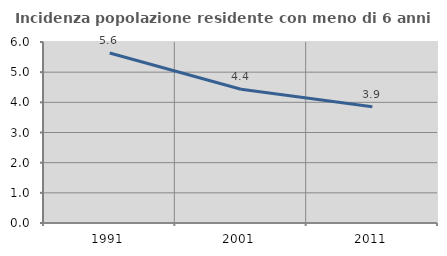
| Category | Incidenza popolazione residente con meno di 6 anni |
|---|---|
| 1991.0 | 5.633 |
| 2001.0 | 4.434 |
| 2011.0 | 3.855 |